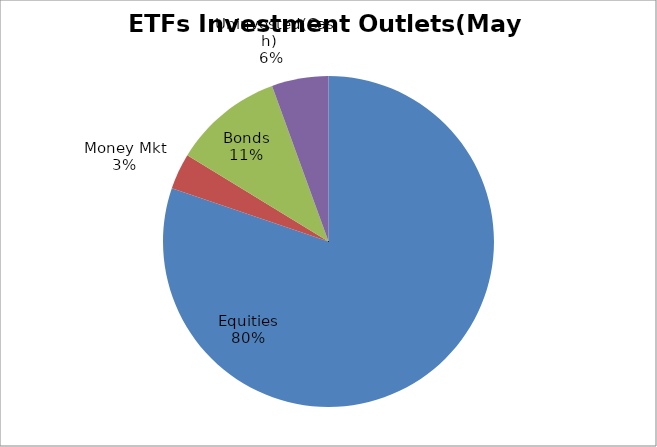
| Category | Series 0 |
|---|---|
| Equities | 4032265012.12 |
| Money Mkt | 177070409.49 |
| Bonds | 538903891.86 |
| Uninvested(Cash) | 278503239.37 |